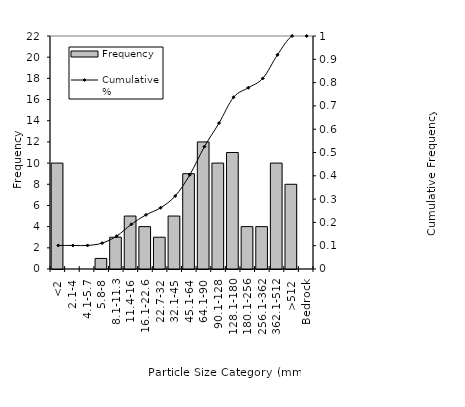
| Category | Frequency |
|---|---|
| <2 | 10 |
| 2.1-4 | 0 |
| 4.1-5.7 | 0 |
| 5.8-8 | 1 |
| 8.1-11.3 | 3 |
| 11.4-16 | 5 |
| 16.1-22.6 | 4 |
| 22.7-32 | 3 |
| 32.1-45 | 5 |
| 45.1-64 | 9 |
| 64.1-90 | 12 |
| 90.1-128 | 10 |
| 128.1-180 | 11 |
| 180.1-256 | 4 |
| 256.1-362 | 4 |
| 362.1-512 | 10 |
| >512 | 8 |
| Bedrock | 0 |